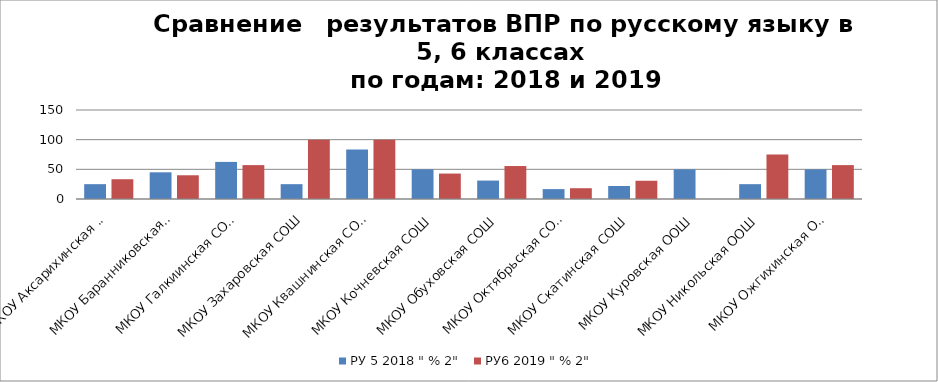
| Category | РУ 5 2018 " % 2" | РУ6 2019 " % 2" |
|---|---|---|
| МКОУ Аксарихинская СОШ | 25 | 33.333 |
| МКОУ Баранниковская СОШ | 45 | 40 |
| МКОУ Галкиинская СОШ | 62.5 | 57.143 |
| МКОУ Захаровская СОШ | 25 | 100 |
| МКОУ Квашнинская СОШ | 83.333 | 100 |
| МКОУ Кочневская СОШ | 50 | 42.857 |
| МКОУ Обуховская СОШ | 31.034 | 55.556 |
| МКОУ Октябрьская СОШ | 16.667 | 18.182 |
| МКОУ Скатинская СОШ | 21.875 | 30.769 |
| МКОУ Куровская ООШ | 50 | 0 |
| МКОУ Никольская ООШ | 25 | 75 |
| МКОУ Ожгихинская ООШ | 50 | 57.143 |